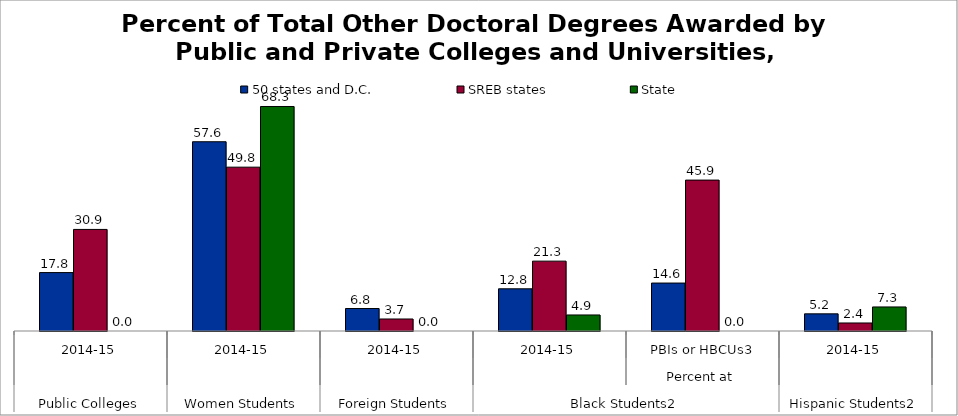
| Category | 50 states and D.C. | SREB states | State |
|---|---|---|---|
| 0 | 17.769 | 30.897 | 0 |
| 1 | 57.567 | 49.834 | 68.293 |
| 2 | 6.839 | 3.654 | 0 |
| 3 | 12.834 | 21.254 | 4.878 |
| 4 | 14.583 | 45.902 | 0 |
| 5 | 5.214 | 2.439 | 7.317 |